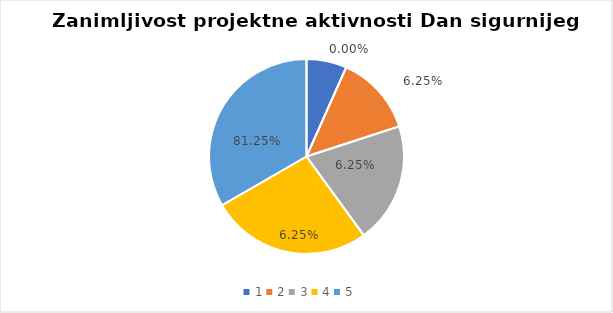
| Category | Series 0 | Series 1 |
|---|---|---|
| 0 | 1 | 0 |
| 1 | 2 | 0.062 |
| 2 | 3 | 0.062 |
| 3 | 4 | 0.062 |
| 4 | 5 | 0.812 |